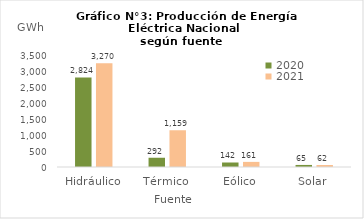
| Category | 2020 | 2021 |
|---|---|---|
| Hidráulico | 2824.08 | 3269.728 |
| Térmico | 291.58 | 1158.714 |
| Eólico | 142.075 | 161.228 |
| Solar | 64.591 | 62.391 |